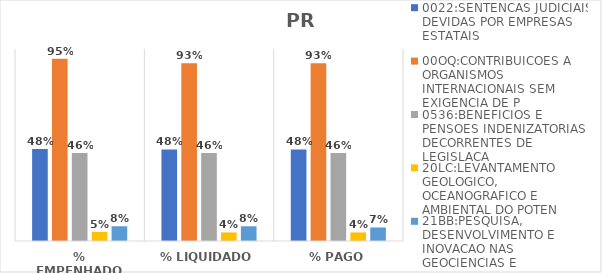
| Category | 0022:SENTENCAS JUDICIAIS DEVIDAS POR EMPRESAS ESTATAIS | 00OQ:CONTRIBUICOES A ORGANISMOS INTERNACIONAIS SEM EXIGENCIA DE P | 0536:BENEFICIOS E PENSOES INDENIZATORIAS DECORRENTES DE LEGISLACA | 20LC:LEVANTAMENTO GEOLOGICO, OCEANOGRAFICO E AMBIENTAL DO POTEN | 21BB:PESQUISA, DESENVOLVIMENTO E INOVACAO NAS GEOCIENCIAS E |
|---|---|---|---|---|---|
| % EMPENHADO | 0.479 | 0.95 | 0.459 | 0.047 | 0.077 |
| % LIQUIDADO | 0.477 | 0.926 | 0.459 | 0.045 | 0.077 |
| % PAGO | 0.477 | 0.926 | 0.459 | 0.045 | 0.07 |